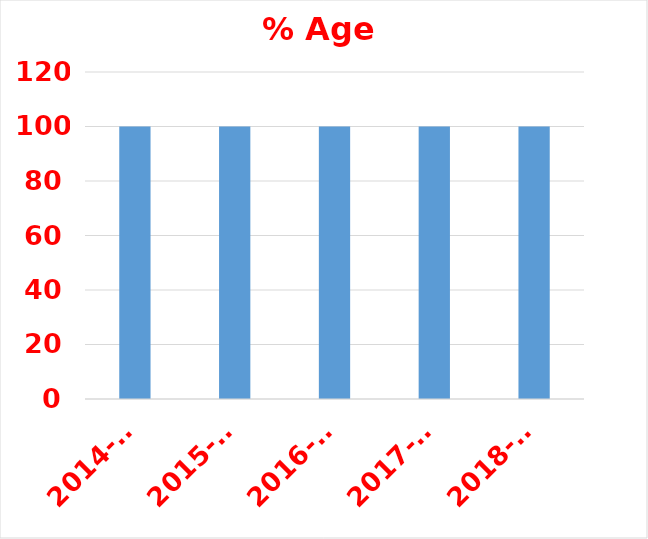
| Category | % Age  |
|---|---|
| 2014-15 | 100 |
| 2015-16 | 100 |
| 2016-17 | 100 |
| 2017-18 | 100 |
| 2018-19 | 100 |